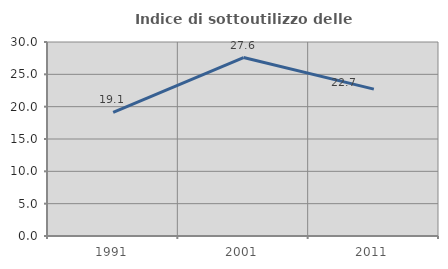
| Category | Indice di sottoutilizzo delle abitazioni  |
|---|---|
| 1991.0 | 19.133 |
| 2001.0 | 27.598 |
| 2011.0 | 22.711 |